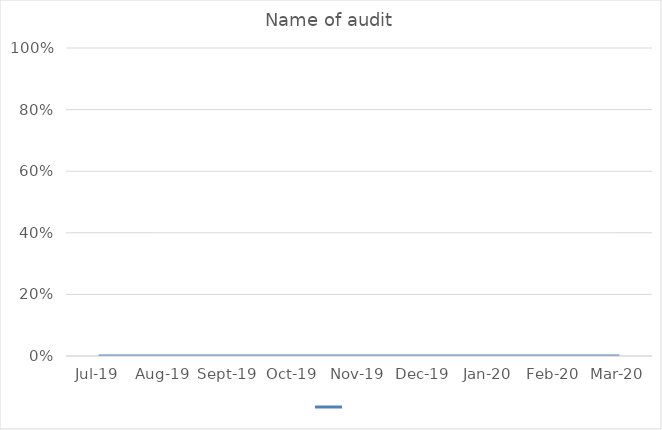
| Category | Series 0 |
|---|---|
| 2019-07-01 | 0 |
| 2019-08-01 | 0 |
| 2019-09-01 | 0 |
| 2019-10-01 | 0 |
| 2019-11-01 | 0 |
| 2019-12-01 | 0 |
| 2020-01-01 | 0 |
| 2020-02-01 | 0 |
| 2020-03-01 | 0 |